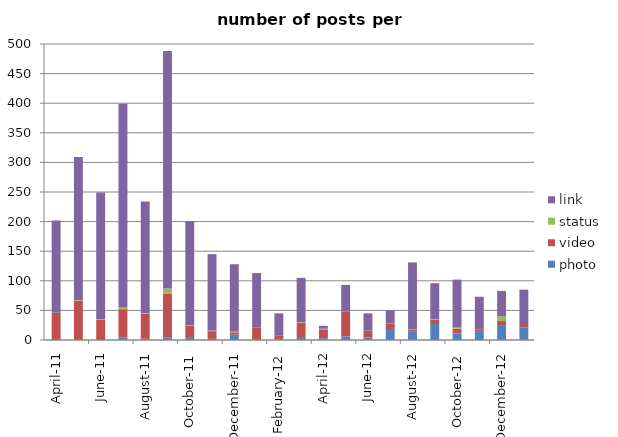
| Category | photo | video | status | link |
|---|---|---|---|---|
| 2011-04-01 | 0 | 46 | 0 | 156 |
| 2011-05-02 | 0 | 66 | 1 | 242 |
| 2011-06-02 | 0 | 34 | 1 | 214 |
| 2011-07-02 | 4 | 48 | 3 | 344 |
| 2011-08-02 | 2 | 42 | 1 | 189 |
| 2011-09-02 | 4 | 74 | 9 | 401 |
| 2011-10-02 | 5 | 19 | 1 | 176 |
| 2011-11-02 | 2 | 13 | 1 | 129 |
| 2011-12-02 | 9 | 4 | 1 | 114 |
| 2012-01-02 | 1 | 20 | 0 | 92 |
| 2012-02-02 | 1 | 7 | 0 | 37 |
| 2012-03-02 | 5 | 24 | 1 | 75 |
| 2012-04-02 | 3 | 15 | 1 | 5 |
| 2012-05-02 | 6 | 42 | 0 | 45 |
| 2012-06-02 | 4 | 12 | 0 | 29 |
| 2012-07-02 | 17 | 11 | 0 | 22 |
| 2012-08-02 | 15 | 2 | 1 | 113 |
| 2012-09-02 | 27 | 7 | 1 | 61 |
| 2012-10-02 | 11 | 8 | 2 | 81 |
| 2012-11-02 | 15 | 3 | 0 | 55 |
| 2012-12-02 | 24 | 8 | 8 | 43 |
| 2013-01-02 | 21 | 6 | 0 | 58 |